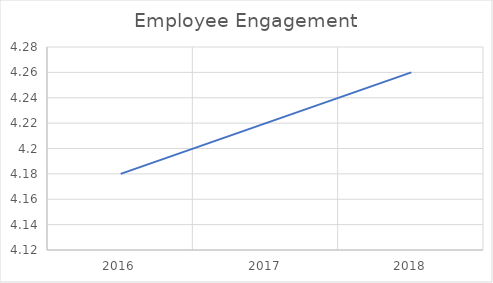
| Category | Series 0 |
|---|---|
| 2016.0 | 4.18 |
| 2017.0 | 4.22 |
| 2018.0 | 4.26 |